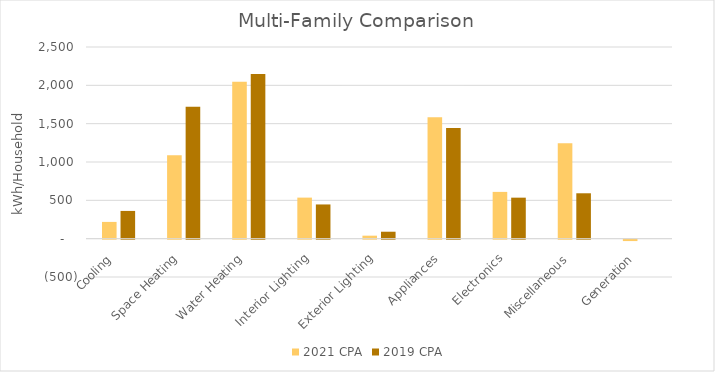
| Category | 2021 CPA | 2019 CPA |
|---|---|---|
| Cooling | 218.583 | 361.778 |
| Space Heating | 1088.584 | 1719.637 |
| Water Heating | 2046.725 | 2146.586 |
| Interior Lighting | 535.468 | 446.277 |
| Exterior Lighting | 39.059 | 90.635 |
| Appliances | 1582.536 | 1442.775 |
| Electronics | 610.06 | 534.826 |
| Miscellaneous | 1243.303 | 592.03 |
| Generation | -18.267 | 0 |